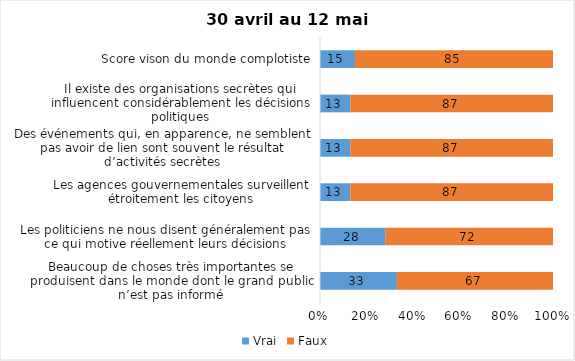
| Category | Vrai | Faux |
|---|---|---|
| Beaucoup de choses très importantes se produisent dans le monde dont le grand public n’est pas informé | 33 | 67 |
| Les politiciens ne nous disent généralement pas ce qui motive réellement leurs décisions | 28 | 72 |
| Les agences gouvernementales surveillent étroitement les citoyens | 13 | 87 |
| Des événements qui, en apparence, ne semblent pas avoir de lien sont souvent le résultat d’activités secrètes | 13 | 87 |
| Il existe des organisations secrètes qui influencent considérablement les décisions politiques | 13 | 87 |
| Score vison du monde complotiste | 15 | 85 |